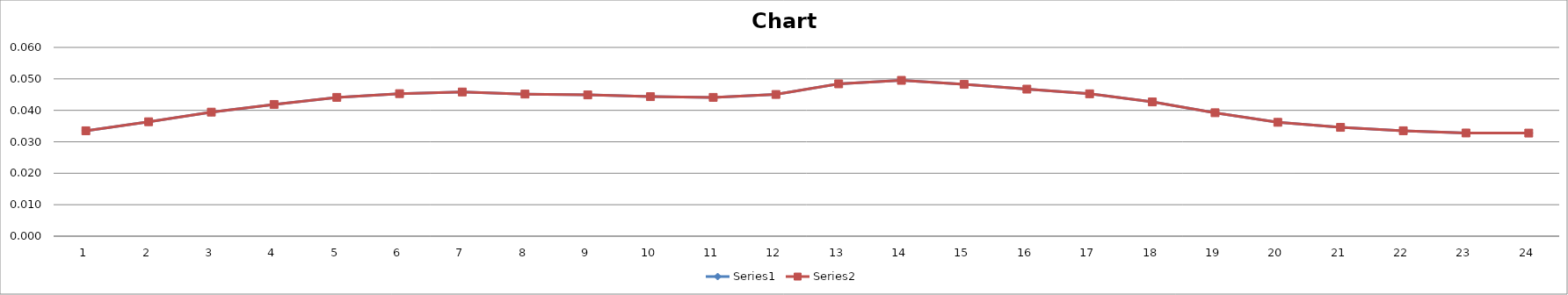
| Category | Series 0 | Series 1 |
|---|---|---|
| 0 | 0.034 | 0.034 |
| 1 | 0.036 | 0.036 |
| 2 | 0.039 | 0.039 |
| 3 | 0.042 | 0.042 |
| 4 | 0.044 | 0.044 |
| 5 | 0.045 | 0.045 |
| 6 | 0.046 | 0.046 |
| 7 | 0.045 | 0.045 |
| 8 | 0.045 | 0.045 |
| 9 | 0.044 | 0.044 |
| 10 | 0.044 | 0.044 |
| 11 | 0.045 | 0.045 |
| 12 | 0.048 | 0.048 |
| 13 | 0.05 | 0.05 |
| 14 | 0.048 | 0.048 |
| 15 | 0.047 | 0.047 |
| 16 | 0.045 | 0.045 |
| 17 | 0.043 | 0.043 |
| 18 | 0.039 | 0.039 |
| 19 | 0.036 | 0.036 |
| 20 | 0.035 | 0.035 |
| 21 | 0.034 | 0.034 |
| 22 | 0.033 | 0.033 |
| 23 | 0.033 | 0.033 |